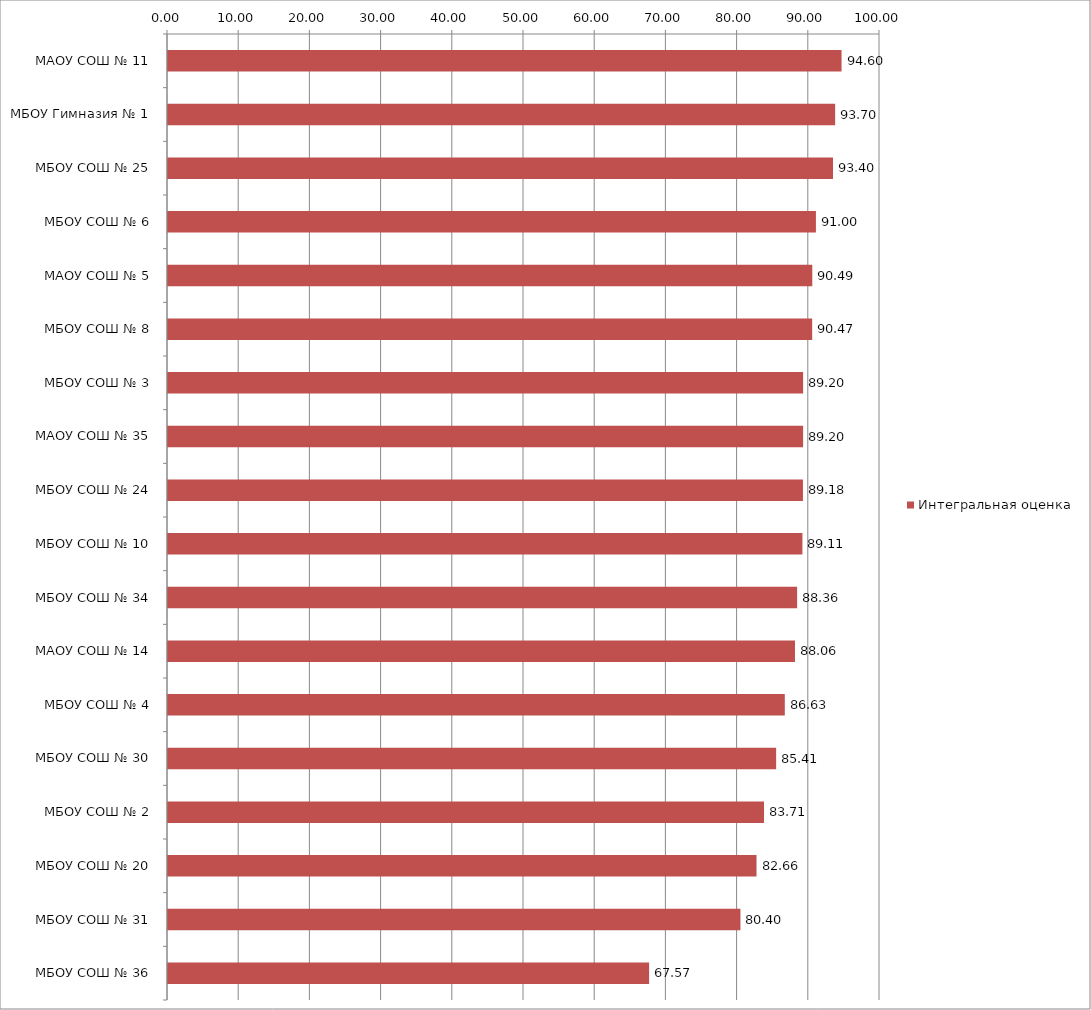
| Category | Интегральная оценка |
|---|---|
| МАОУ СОШ № 11 | 94.6 |
| МБОУ Гимназия № 1 | 93.7 |
| МБОУ СОШ № 25 | 93.4 |
| МБОУ СОШ № 6 | 91 |
| МАОУ СОШ № 5 | 90.491 |
| МБОУ СОШ № 8 | 90.474 |
| МБОУ СОШ № 3 | 89.2 |
| МАОУ СОШ № 35 | 89.2 |
| МБОУ СОШ № 24 | 89.178 |
| МБОУ СОШ № 10 | 89.105 |
| МБОУ СОШ № 34 | 88.36 |
| МАОУ СОШ № 14 | 88.06 |
| МБОУ СОШ № 4 | 86.63 |
| МБОУ СОШ № 30 | 85.415 |
| МБОУ СОШ № 2 | 83.712 |
| МБОУ СОШ № 20 | 82.657 |
| МБОУ СОШ № 31 | 80.4 |
| МБОУ СОШ № 36 | 67.571 |